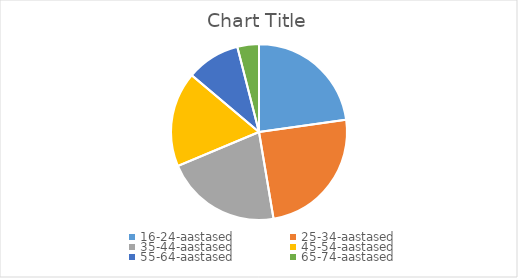
| Category | Series 0 |
|---|---|
| 16-24-aastased | 172600 |
| 25-34-aastased | 186400 |
| 35-44-aastased | 161700 |
| 45-54-aastased | 132400 |
| 55-64-aastased | 74900 |
| 65-74-aastased | 30100 |